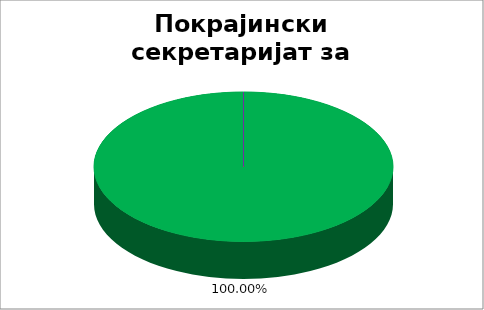
| Category | Покрајински секретаријат за привреду и туризам | Покрајински секретаријат за културу, јавно информисање и односе с верским заједницама |
|---|---|---|
| 0 | 1 | 1 |
| 1 | 0 | 0 |
| 2 | 0 | 0 |
| 3 | 0 | 0 |
| 4 | 0 | 0 |